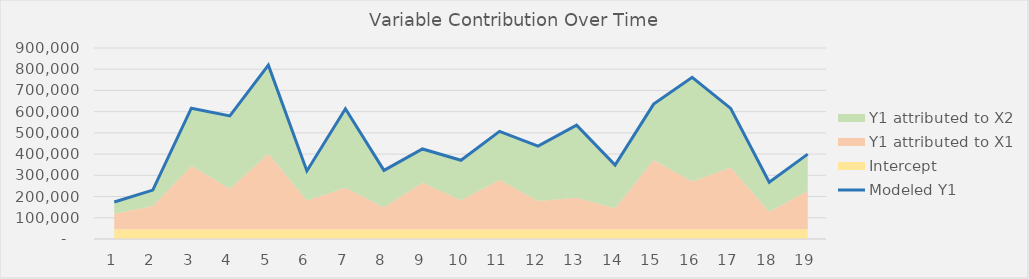
| Category | Modeled Y1 |
|---|---|
| 1.0 | 174078.667 |
| 2.0 | 230532.911 |
| 3.0 | 616518.851 |
| 4.0 | 579832.723 |
| 5.0 | 818929.064 |
| 6.0 | 320652.812 |
| 7.0 | 613760.993 |
| 8.0 | 323225.626 |
| 9.0 | 424281.242 |
| 10.0 | 370786.731 |
| 11.0 | 507225.275 |
| 12.0 | 437330.237 |
| 13.0 | 536574.591 |
| 14.0 | 348219.587 |
| 15.0 | 635646.275 |
| 16.0 | 761987.289 |
| 17.0 | 615311.823 |
| 18.0 | 267700.774 |
| 19.0 | 400040.529 |